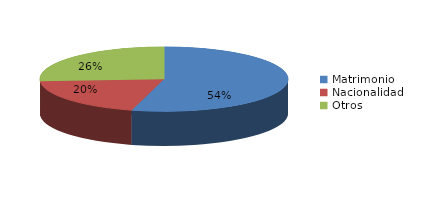
| Category | Series 0 |
|---|---|
| Matrimonio | 27467 |
| Nacionalidad | 9990 |
| Otros | 13227 |